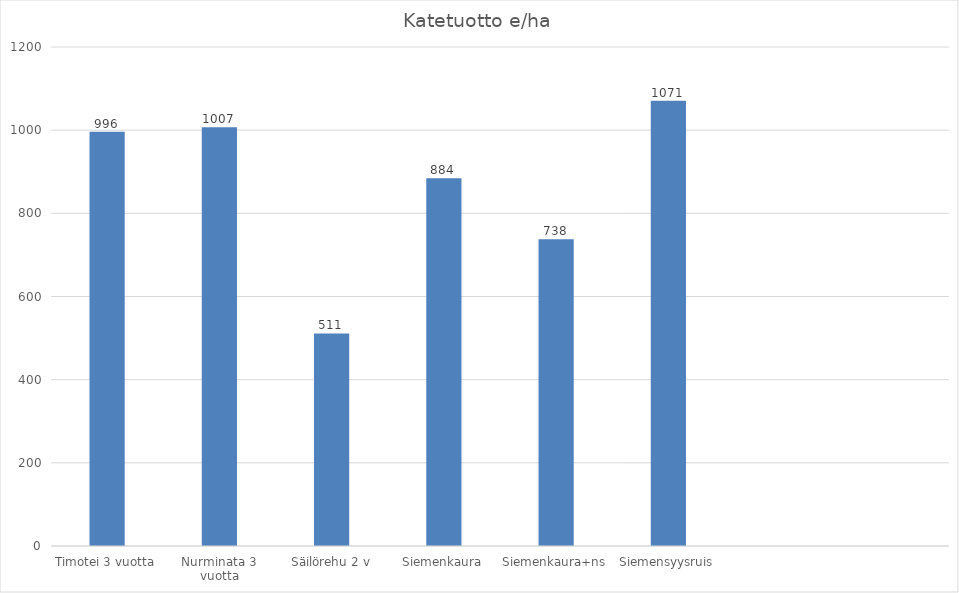
| Category | e/ha |
|---|---|
| Timotei 3 vuotta | 996.4 |
| Nurminata 3 vuotta | 1006.95 |
| Säilörehu 2 v | 511.125 |
| Siemenkaura | 884.3 |
| Siemenkaura+ns | 737.7 |
| Siemensyysruis | 1070.55 |